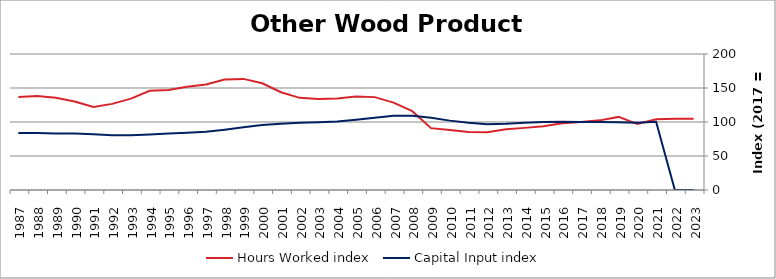
| Category | Hours Worked index | Capital Input index |
|---|---|---|
| 2023.0 | 104.796 | 0 |
| 2022.0 | 104.684 | 0 |
| 2021.0 | 104.128 | 100.326 |
| 2020.0 | 96.949 | 99.011 |
| 2019.0 | 107.501 | 99.49 |
| 2018.0 | 102.409 | 100.068 |
| 2017.0 | 100 | 100 |
| 2016.0 | 98.067 | 100.546 |
| 2015.0 | 93.819 | 100.054 |
| 2014.0 | 91.362 | 99.035 |
| 2013.0 | 89.236 | 97.328 |
| 2012.0 | 84.852 | 96.856 |
| 2011.0 | 85.326 | 98.931 |
| 2010.0 | 88.118 | 102.021 |
| 2009.0 | 90.964 | 106.178 |
| 2008.0 | 115.87 | 109.114 |
| 2007.0 | 128.495 | 109.217 |
| 2006.0 | 136.585 | 106.217 |
| 2005.0 | 137.444 | 103.327 |
| 2004.0 | 134.448 | 100.615 |
| 2003.0 | 133.959 | 99.583 |
| 2002.0 | 135.529 | 98.888 |
| 2001.0 | 143.799 | 97.535 |
| 2000.0 | 156.929 | 95.563 |
| 1999.0 | 163.386 | 92.194 |
| 1998.0 | 162.557 | 88.68 |
| 1997.0 | 155.2 | 85.777 |
| 1996.0 | 151.728 | 84.331 |
| 1995.0 | 147.063 | 83.059 |
| 1994.0 | 145.808 | 81.58 |
| 1993.0 | 134.368 | 80.347 |
| 1992.0 | 126.642 | 80.401 |
| 1991.0 | 121.95 | 81.94 |
| 1990.0 | 130.04 | 83.194 |
| 1989.0 | 135.639 | 83.181 |
| 1988.0 | 138.387 | 83.814 |
| 1987.0 | 136.758 | 83.86 |